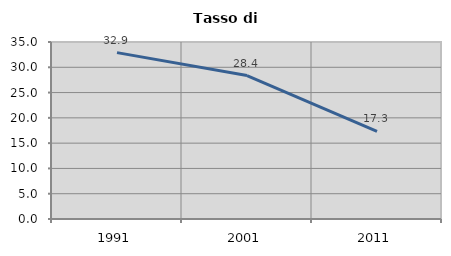
| Category | Tasso di disoccupazione   |
|---|---|
| 1991.0 | 32.896 |
| 2001.0 | 28.371 |
| 2011.0 | 17.318 |